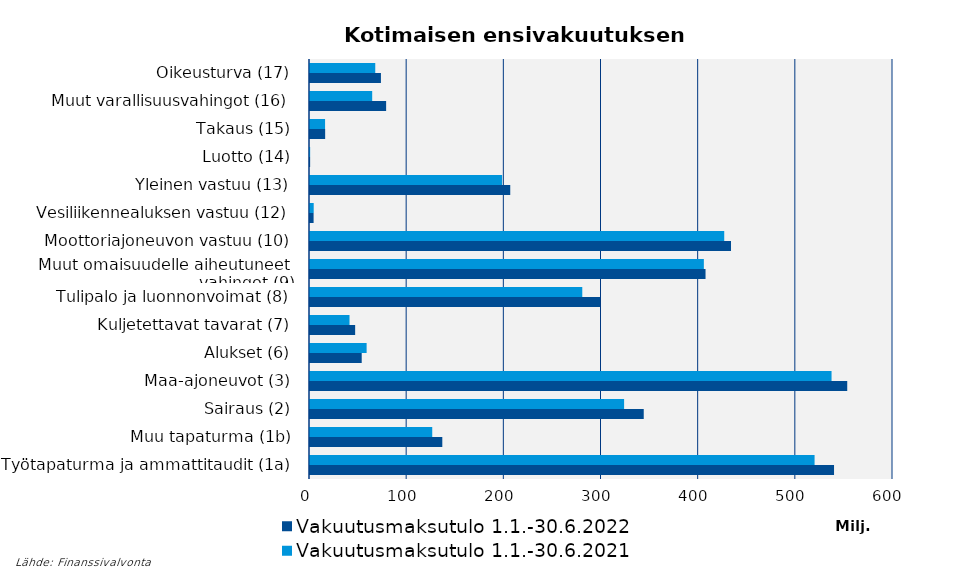
| Category | Vakuutusmaksutulo |
|---|---|
| Työtapaturma ja ammattitaudit (1a) | 519287.794 |
| Muu tapaturma (1b) | 125804.516 |
| Sairaus (2) | 323263.784 |
| Maa-ajoneuvot (3) | 536756.735 |
| Alukset (6) | 58273.936 |
| Kuljetettavat tavarat (7) | 40669.453 |
| Tulipalo ja luonnonvoimat (8) | 280218.114 |
| Muut omaisuudelle aiheutuneet 
vahingot (9) | 405337.963 |
| Moottoriajoneuvon vastuu (10) | 426312.893 |
| Vesiliikennealuksen vastuu (12) | 3808.364 |
| Yleinen vastuu (13) | 197728.066 |
| Luotto (14) | 148.165 |
| Takaus (15) | 15512.136 |
| Muut varallisuusvahingot (16) | 64006.947 |
| Oikeusturva (17) | 67164.273 |